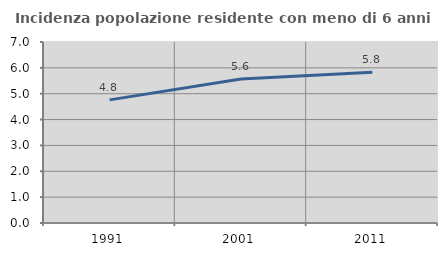
| Category | Incidenza popolazione residente con meno di 6 anni |
|---|---|
| 1991.0 | 4.762 |
| 2001.0 | 5.572 |
| 2011.0 | 5.832 |